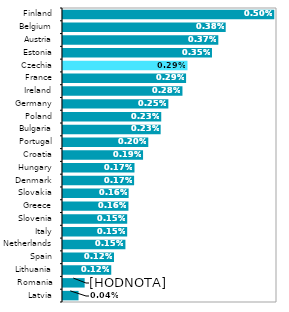
| Category | Series 0 |
|---|---|
| Latvia | 0 |
| Romania | 0.001 |
| Lithuania | 0.001 |
| Spain | 0.001 |
| Netherlands | 0.001 |
| Italy | 0.002 |
| Slovenia | 0.002 |
| Greece | 0.002 |
| Slovakia | 0.002 |
| Denmark | 0.002 |
| Hungary | 0.002 |
| Croatia | 0.002 |
| Portugal | 0.002 |
| Bulgaria | 0.002 |
| Poland | 0.002 |
| Germany | 0.002 |
| Ireland | 0.003 |
| France | 0.003 |
| Czechia | 0.003 |
| Estonia | 0.004 |
| Austria | 0.004 |
| Belgium | 0.004 |
| Finland | 0.005 |